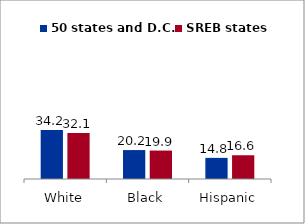
| Category | 50 states and D.C. | SREB states |
|---|---|---|
| White | 34.211 | 32.102 |
| Black | 20.229 | 19.888 |
| Hispanic | 14.777 | 16.603 |